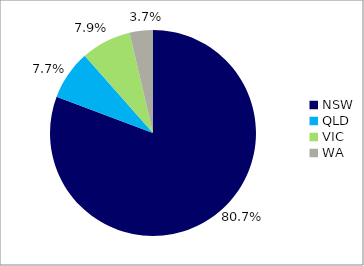
| Category | Series 0 |
|---|---|
| NSW | 0.807 |
| QLD | 0.077 |
| VIC | 0.079 |
| WA | 0.037 |